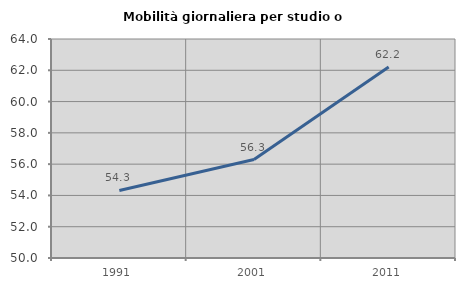
| Category | Mobilità giornaliera per studio o lavoro |
|---|---|
| 1991.0 | 54.316 |
| 2001.0 | 56.292 |
| 2011.0 | 62.216 |